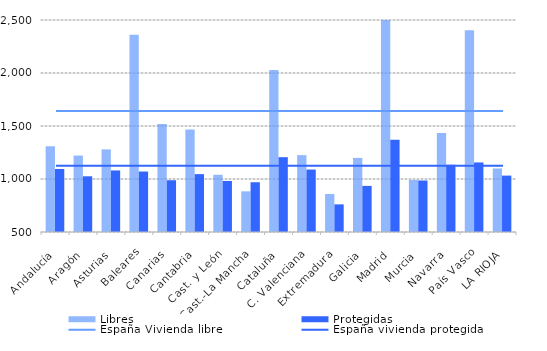
| Category | Libres | Protegidas |
|---|---|---|
| Andalucía | 1308.15 | 1094.375 |
| Aragón | 1221.35 | 1025.6 |
| Asturias | 1279.225 | 1080.675 |
| Baleares | 2360.8 | 1070.325 |
| Canarias | 1519.25 | 988.475 |
| Cantabria | 1465.925 | 1045.9 |
| Cast. y León | 1040.075 | 981.55 |
| Cast.-La Mancha | 883.95 | 969.425 |
| Cataluña | 2029.2 | 1205.925 |
| C. Valenciana | 1225.4 | 1089.175 |
| Extremadura | 858.55 | 760.75 |
| Galicia | 1199.1 | 934.95 |
| Madrid | 2626.45 | 1370.85 |
| Murcia | 990.95 | 985.875 |
| Navarra | 1434.2 | 1134.125 |
| País Vasco | 2402.775 | 1156.2 |
| LA RIOJA | 1099.675 | 1032.1 |